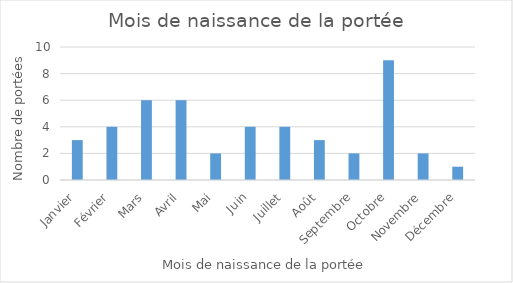
| Category | Series 0 |
|---|---|
| Janvier | 3 |
| Février | 4 |
| Mars | 6 |
| Avril | 6 |
| Mai | 2 |
| Juin | 4 |
| Juillet | 4 |
| Août | 3 |
| Septembre | 2 |
| Octobre | 9 |
| Novembre | 2 |
| Décembre | 1 |